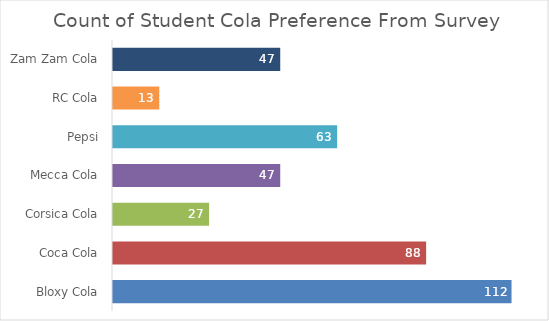
| Category | Total |
|---|---|
| Bloxy Cola | 112 |
| Coca Cola | 88 |
| Corsica Cola | 27 |
| Mecca Cola | 47 |
| Pepsi | 63 |
| RC Cola | 13 |
| Zam Zam Cola | 47 |